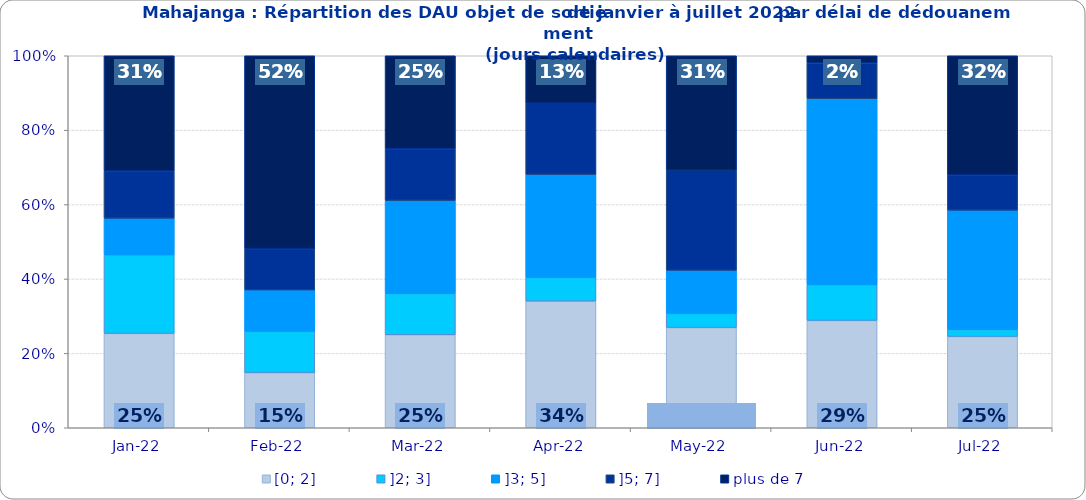
| Category | [0; 2] | ]2; 3] | ]3; 5] | ]5; 7] | plus de 7 |
|---|---|---|---|---|---|
| 2022-01-01 | 0.254 | 0.211 | 0.099 | 0.127 | 0.31 |
| 2022-02-01 | 0.148 | 0.111 | 0.111 | 0.111 | 0.519 |
| 2022-03-01 | 0.25 | 0.111 | 0.25 | 0.139 | 0.25 |
| 2022-04-01 | 0.34 | 0.064 | 0.277 | 0.191 | 0.128 |
| 2022-05-01 | 0.269 | 0.038 | 0.115 | 0.269 | 0.308 |
| 2022-06-01 | 0.288 | 0.096 | 0.5 | 0.096 | 0.019 |
| 2022-07-01 | 0.245 | 0.019 | 0.321 | 0.094 | 0.321 |